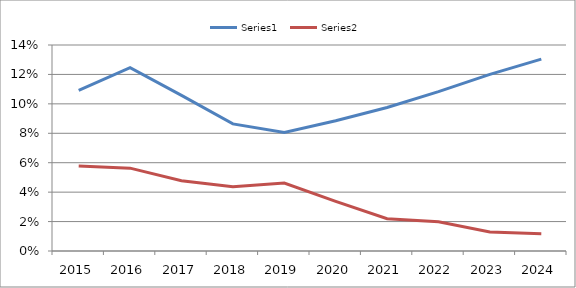
| Category | Series 0 | Series 1 |
|---|---|---|
| 2015.0 | 0.109 | 0.058 |
| 2016.0 | 0.125 | 0.056 |
| 2017.0 | 0.106 | 0.048 |
| 2018.0 | 0.086 | 0.044 |
| 2019.0 | 0.081 | 0.046 |
| 2020.0 | 0.088 | 0.034 |
| 2021.0 | 0.098 | 0.022 |
| 2022.0 | 0.108 | 0.02 |
| 2023.0 | 0.12 | 0.013 |
| 2024.0 | 0.13 | 0.012 |